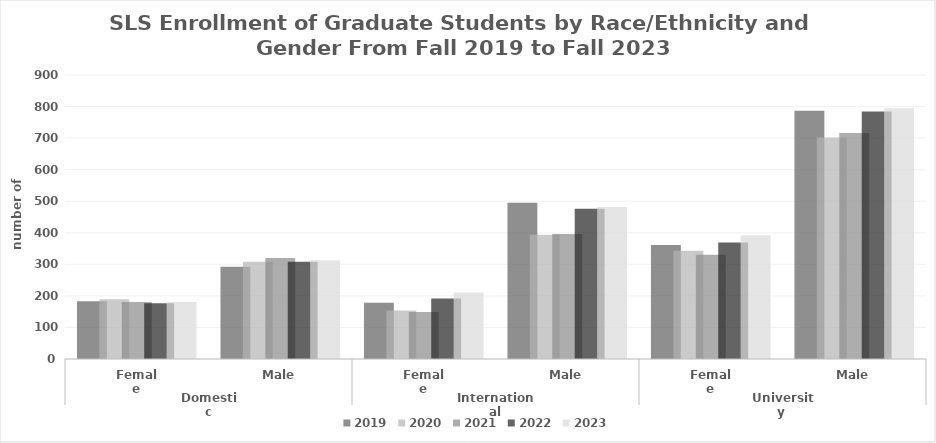
| Category | 2019  | 2020  | 2021  | 2022  | 2023  |
|---|---|---|---|---|---|
| 0 | 183 | 189 | 181 | 177 | 181 |
| 1 | 292 | 308 | 320 | 308 | 313 |
| 2 | 178 | 154 | 149 | 192 | 211 |
| 3 | 495 | 394 | 396 | 476 | 482 |
| 4 | 361 | 343 | 330 | 369 | 392 |
| 5 | 787 | 702 | 716 | 784 | 795 |